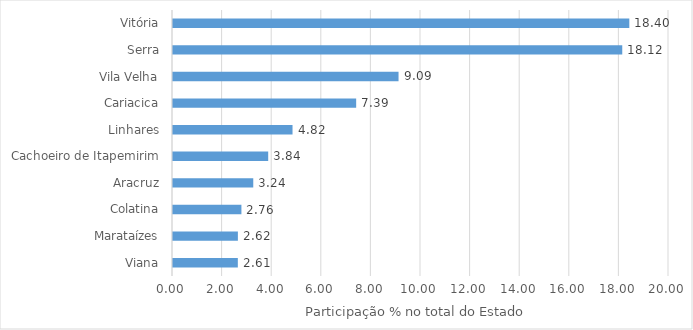
| Category | Series 0 |
|---|---|
| Viana | 2.614 |
| Marataízes | 2.616 |
| Colatina | 2.759 |
| Aracruz | 3.236 |
| Cachoeiro de Itapemirim | 3.839 |
| Linhares | 4.82 |
| Cariacica | 7.386 |
| Vila Velha | 9.094 |
| Serra | 18.115 |
| Vitória | 18.4 |